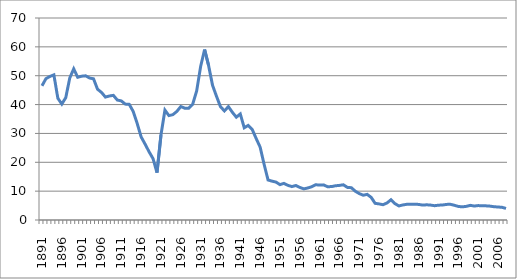
| Category | Average tariff rate on dutiable imports |
|---|---|
| 1891 | 46.5 |
| 1892 | 48.98 |
| 1893 | 49.75 |
| 1894 | 50.29 |
| 1895 | 42.19 |
| 1896 | 40.18 |
| 1897 | 42.41 |
| 1898 | 49.2 |
| 1899 | 52.38 |
| 1900 | 49.46 |
| 1901 | 49.83 |
| 1902 | 49.97 |
| 1903 | 49.2 |
| 1904 | 48.92 |
| 1905 | 45.33 |
| 1906 | 44.22 |
| 1907 | 42.6 |
| 1908 | 42.98 |
| 1909 | 43.19 |
| 1910 | 41.56 |
| 1911 | 41.27 |
| 1912 | 40.16 |
| 1913 | 40.08 |
| 1914 | 37.63 |
| 1915 | 33.46 |
| 1916 | 28.8 |
| 1917 | 26.28 |
| 1918 | 23.65 |
| 1919 | 21.27 |
| 1920 | 16.4 |
| 1921 | 29.46 |
| 1922 | 38.07 |
| 1923 | 36.17 |
| 1924 | 36.53 |
| 1925 | 37.61 |
| 1926 | 39.34 |
| 1927 | 38.76 |
| 1928 | 38.76 |
| 1929 | 40.1 |
| 1930 | 44.71 |
| 1931 | 53.21 |
| 1932 | 59.06 |
| 1933 | 53.58 |
| 1934 | 46.7 |
| 1935 | 42.88 |
| 1936 | 39.28 |
| 1937 | 37.8 |
| 1938 | 39.3 |
| 1939 | 37.33 |
| 1940 | 35.63 |
| 1941 | 36.75 |
| 1942 | 31.96 |
| 1943 | 32.79 |
| 1944 | 31.41 |
| 1945 | 28.24 |
| 1946 | 25.28 |
| 1947 | 19.34 |
| 1948 | 13.87 |
| 1949 | 13.46 |
| 1950 | 13.14 |
| 1951 | 12.26 |
| 1952 | 12.69 |
| 1953 | 12.02 |
| 1954 | 11.58 |
| 1955 | 11.95 |
| 1956 | 11.3 |
| 1957 | 10.79 |
| 1958 | 11.09 |
| 1959 | 11.53 |
| 1960 | 12.22 |
| 1961 | 12.1 |
| 1962 | 12.17 |
| 1963 | 11.54 |
| 1964 | 11.58 |
| 1965 | 11.86 |
| 1966 | 11.99 |
| 1967 | 12.2 |
| 1968 | 11.3 |
| 1969 | 11.19 |
| 1970 | 9.98 |
| 1971 | 9.15 |
| 1972 | 8.59 |
| 1973 | 8.88 |
| 1974 | 7.84 |
| 1975 | 5.77 |
| 1976 | 5.57 |
| 1977 | 5.3 |
| 1978 | 5.91 |
| 1979 | 7.02 |
| 1980 | 5.67 |
| 1981 | 4.87 |
| 1982 | 5.22 |
| 1983 | 5.44 |
| 1984 | 5.47 |
| 1985 | 5.5 |
| 1986 | 5.39 |
| 1987 | 5.16 |
| 1988 | 5.27 |
| 1989 | 5.16 |
| 1990 | 4.96 |
| 1991 | 5.14 |
| 1992 | 5.19 |
| 1993 | 5.41 |
| 1994 | 5.43 |
| 1995 | 5.09 |
| 1996 | 4.69 |
| 1997 | 4.56 |
| 1998 | 4.73 |
| 1999 | 5.07 |
| 2000 | 4.84 |
| 2001 | 5 |
| 2002 | 4.9 |
| 2003 | 4.9 |
| 2004 | 4.8 |
| 2005 | 4.6 |
| 2006 | 4.5 |
| 2007 | 4.4 |
| 2008 | 4 |